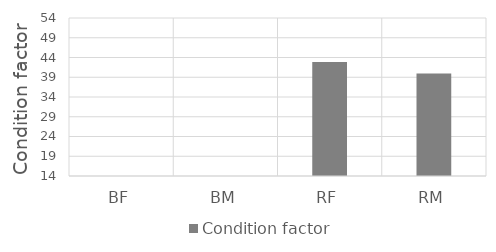
| Category | Condition factor |
|---|---|
| BF | 0 |
| BM | 0 |
| RF | 42.877 |
| RM | 39.925 |